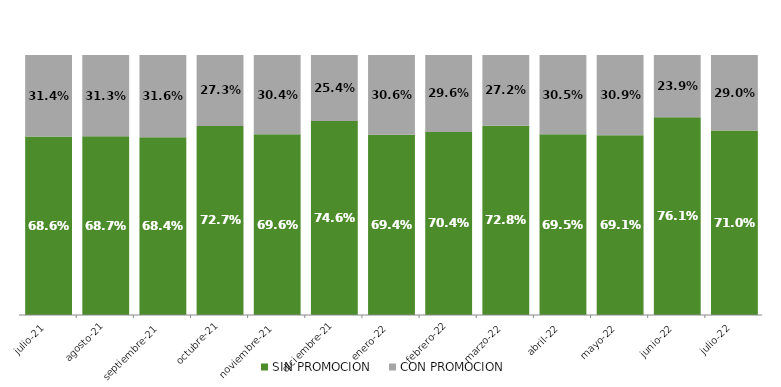
| Category | SIN PROMOCION   | CON PROMOCION   |
|---|---|---|
| 2021-07-01 | 0.686 | 0.314 |
| 2021-08-01 | 0.687 | 0.313 |
| 2021-09-01 | 0.684 | 0.316 |
| 2021-10-01 | 0.727 | 0.273 |
| 2021-11-01 | 0.696 | 0.304 |
| 2021-12-01 | 0.746 | 0.254 |
| 2022-01-01 | 0.694 | 0.306 |
| 2022-02-01 | 0.704 | 0.296 |
| 2022-03-01 | 0.728 | 0.272 |
| 2022-04-01 | 0.695 | 0.305 |
| 2022-05-01 | 0.691 | 0.309 |
| 2022-06-01 | 0.761 | 0.239 |
| 2022-07-01 | 0.71 | 0.29 |